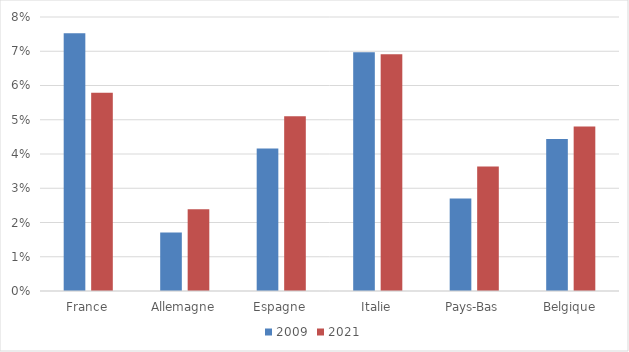
| Category | 2009 | 2021 |
|---|---|---|
| France | 0.075 | 0.058 |
| Allemagne | 0.017 | 0.024 |
| Espagne | 0.042 | 0.051 |
| Italie | 0.07 | 0.069 |
| Pays-Bas | 0.027 | 0.036 |
| Belgique | 0.044 | 0.048 |